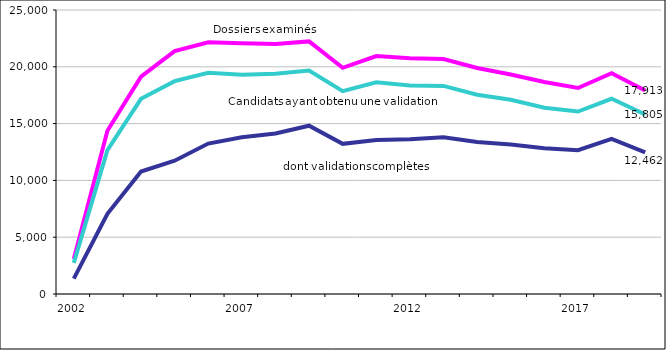
| Category | Nombre de dossiers examinés (décisions rendues) | Candidats ayant obtenu une validation, même partielle | Validations totales |
|---|---|---|---|
| 2002.0 | 3089 | 2740 | 1360 |
| 2003.0 | 14374 | 12666 | 7061 |
| 2004.0 | 19136 | 17181 | 10778 |
| 2005.0 | 21379 | 18734 | 11736 |
| 2006.0 | 22160 | 19477 | 13244 |
| 2007.0 | 22073 | 19300 | 13800 |
| 2008.0 | 22013 | 19384 | 14127 |
| 2009.0 | 22234 | 19679 | 14813 |
| 2010.0 | 19914 | 17855 | 13220 |
| 2011.0 | 20950 | 18640 | 13560 |
| 2012.0 | 20762 | 18360 | 13628 |
| 2013.0 | 20682 | 18317 | 13805 |
| 2014.0 | 19893 | 17547 | 13378 |
| 2015.0 | 19324 | 17099 | 13153 |
| 2016.0 | 18660 | 16401 | 12836 |
| 2017.0 | 18135 | 16060 | 12657 |
| 2018.0 | 19436 | 17186 | 13652 |
| 2019.0 | 17913 | 15805 | 12462 |